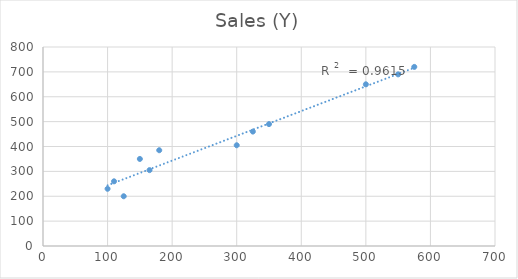
| Category | Sales (Y) |
|---|---|
| 100.0 | 230 |
| 110.0 | 260 |
| 125.0 | 200 |
| 150.0 | 350 |
| 165.0 | 305 |
| 180.0 | 385 |
| 300.0 | 405 |
| 325.0 | 460 |
| 350.0 | 490 |
| 500.0 | 650 |
| 550.0 | 690 |
| 575.0 | 720 |